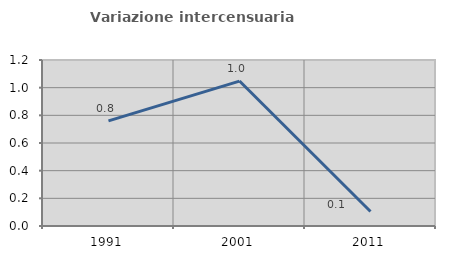
| Category | Variazione intercensuaria annua |
|---|---|
| 1991.0 | 0.76 |
| 2001.0 | 1.048 |
| 2011.0 | 0.105 |